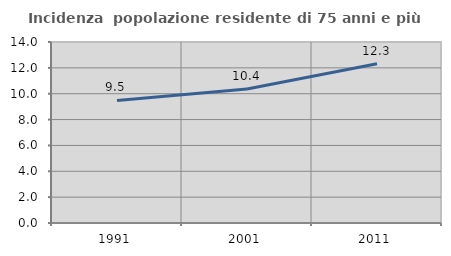
| Category | Incidenza  popolazione residente di 75 anni e più |
|---|---|
| 1991.0 | 9.483 |
| 2001.0 | 10.369 |
| 2011.0 | 12.324 |